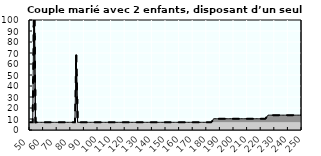
| Category | Coin fiscal marginal (somme des composantes) | Taux d’imposition marginal net |
|---|---|---|
| 50.0 | 7 | 7 |
| 51.0 | 7 | 7 |
| 52.0 | 7 | 7 |
| 53.0 | 138.539 | 138.539 |
| 54.0 | 7 | 7 |
| 55.0 | 7 | 7 |
| 56.0 | 7 | 7 |
| 57.0 | 7 | 7 |
| 58.0 | 7 | 7 |
| 59.0 | 7 | 7 |
| 60.0 | 7 | 7 |
| 61.0 | 7 | 7 |
| 62.0 | 7 | 7 |
| 63.0 | 7 | 7 |
| 64.0 | 7 | 7 |
| 65.0 | 7 | 7 |
| 66.0 | 7 | 7 |
| 67.0 | 7 | 7 |
| 68.0 | 7 | 7 |
| 69.0 | 7 | 7 |
| 70.0 | 7 | 7 |
| 71.0 | 7 | 7 |
| 72.0 | 7 | 7 |
| 73.0 | 7 | 7 |
| 74.0 | 7 | 7 |
| 75.0 | 7 | 7 |
| 76.0 | 7 | 7 |
| 77.0 | 7 | 7 |
| 78.0 | 7 | 7 |
| 79.0 | 7 | 7 |
| 80.0 | 7 | 7 |
| 81.0 | 7 | 7 |
| 82.0 | 7 | 7 |
| 83.0 | 7 | 7 |
| 84.0 | 67.789 | 67.789 |
| 85.0 | 7 | 7 |
| 86.0 | 7 | 7 |
| 87.0 | 7 | 7 |
| 88.0 | 7 | 7 |
| 89.0 | 7 | 7 |
| 90.0 | 7 | 7 |
| 91.0 | 7 | 7 |
| 92.0 | 7 | 7 |
| 93.0 | 7 | 7 |
| 94.0 | 7 | 7 |
| 95.0 | 7 | 7 |
| 96.0 | 7 | 7 |
| 97.0 | 7 | 7 |
| 98.0 | 7 | 7 |
| 99.0 | 7 | 7 |
| 100.0 | 7 | 7 |
| 101.0 | 7 | 7 |
| 102.0 | 7 | 7 |
| 103.0 | 7 | 7 |
| 104.0 | 7 | 7 |
| 105.0 | 7 | 7 |
| 106.0 | 7 | 7 |
| 107.0 | 7 | 7 |
| 108.0 | 7 | 7 |
| 109.0 | 7 | 7 |
| 110.0 | 7 | 7 |
| 111.0 | 7 | 7 |
| 112.0 | 7 | 7 |
| 113.0 | 7 | 7 |
| 114.0 | 7 | 7 |
| 115.0 | 7 | 7 |
| 116.0 | 7 | 7 |
| 117.0 | 7 | 7 |
| 118.0 | 7 | 7 |
| 119.0 | 7 | 7 |
| 120.0 | 7 | 7 |
| 121.0 | 7 | 7 |
| 122.0 | 7 | 7 |
| 123.0 | 7 | 7 |
| 124.0 | 7 | 7 |
| 125.0 | 7 | 7 |
| 126.0 | 7 | 7 |
| 127.0 | 7 | 7 |
| 128.0 | 7 | 7 |
| 129.0 | 7 | 7 |
| 130.0 | 7 | 7 |
| 131.0 | 7 | 7 |
| 132.0 | 7 | 7 |
| 133.0 | 7 | 7 |
| 134.0 | 7 | 7 |
| 135.0 | 7 | 7 |
| 136.0 | 7 | 7 |
| 137.0 | 7 | 7 |
| 138.0 | 7 | 7 |
| 139.0 | 7 | 7 |
| 140.0 | 7 | 7 |
| 141.0 | 7 | 7 |
| 142.0 | 7 | 7 |
| 143.0 | 7 | 7 |
| 144.0 | 7 | 7 |
| 145.0 | 7 | 7 |
| 146.0 | 7 | 7 |
| 147.0 | 7 | 7 |
| 148.0 | 7 | 7 |
| 149.0 | 7 | 7 |
| 150.0 | 7 | 7 |
| 151.0 | 7 | 7 |
| 152.0 | 7 | 7 |
| 153.0 | 7 | 7 |
| 154.0 | 7 | 7 |
| 155.0 | 7 | 7 |
| 156.0 | 7 | 7 |
| 157.0 | 7 | 7 |
| 158.0 | 7 | 7 |
| 159.0 | 7 | 7 |
| 160.0 | 7 | 7 |
| 161.0 | 7 | 7 |
| 162.0 | 7 | 7 |
| 163.0 | 7 | 7 |
| 164.0 | 7 | 7 |
| 165.0 | 7 | 7 |
| 166.0 | 7 | 7 |
| 167.0 | 7 | 7 |
| 168.0 | 7 | 7 |
| 169.0 | 7 | 7 |
| 170.0 | 7 | 7 |
| 171.0 | 7 | 7 |
| 172.0 | 7 | 7 |
| 173.0 | 7 | 7 |
| 174.0 | 7 | 7 |
| 175.0 | 7 | 7 |
| 176.0 | 7 | 7 |
| 177.0 | 7 | 7 |
| 178.0 | 7 | 7 |
| 179.0 | 7 | 7 |
| 180.0 | 7 | 7 |
| 181.0 | 7 | 7 |
| 182.0 | 7 | 7 |
| 183.0 | 7 | 7 |
| 184.0 | 8.118 | 8.118 |
| 185.0 | 10.25 | 10.25 |
| 186.0 | 10.25 | 10.25 |
| 187.0 | 10.25 | 10.25 |
| 188.0 | 10.25 | 10.25 |
| 189.0 | 10.25 | 10.25 |
| 190.0 | 10.25 | 10.25 |
| 191.0 | 10.25 | 10.25 |
| 192.0 | 10.25 | 10.25 |
| 193.0 | 10.25 | 10.25 |
| 194.0 | 10.25 | 10.25 |
| 195.0 | 10.25 | 10.25 |
| 196.0 | 10.25 | 10.25 |
| 197.0 | 10.25 | 10.25 |
| 198.0 | 10.25 | 10.25 |
| 199.0 | 10.25 | 10.25 |
| 200.0 | 10.25 | 10.25 |
| 201.0 | 10.25 | 10.25 |
| 202.0 | 10.25 | 10.25 |
| 203.0 | 10.25 | 10.25 |
| 204.0 | 10.25 | 10.25 |
| 205.0 | 10.25 | 10.25 |
| 206.0 | 10.25 | 10.25 |
| 207.0 | 10.25 | 10.25 |
| 208.0 | 10.25 | 10.25 |
| 209.0 | 10.25 | 10.25 |
| 210.0 | 10.25 | 10.25 |
| 211.0 | 10.25 | 10.25 |
| 212.0 | 10.25 | 10.25 |
| 213.0 | 10.25 | 10.25 |
| 214.0 | 10.25 | 10.25 |
| 215.0 | 10.25 | 10.25 |
| 216.0 | 10.25 | 10.25 |
| 217.0 | 10.25 | 10.25 |
| 218.0 | 10.25 | 10.25 |
| 219.0 | 10.25 | 10.25 |
| 220.0 | 10.25 | 10.25 |
| 221.0 | 10.25 | 10.25 |
| 222.0 | 10.25 | 10.25 |
| 223.0 | 10.25 | 10.25 |
| 224.0 | 11.683 | 11.683 |
| 225.0 | 13.5 | 13.5 |
| 226.0 | 13.5 | 13.5 |
| 227.0 | 13.5 | 13.5 |
| 228.0 | 13.5 | 13.5 |
| 229.0 | 13.5 | 13.5 |
| 230.0 | 13.5 | 13.5 |
| 231.0 | 13.5 | 13.5 |
| 232.0 | 13.5 | 13.5 |
| 233.0 | 13.5 | 13.5 |
| 234.0 | 13.5 | 13.5 |
| 235.0 | 13.5 | 13.5 |
| 236.0 | 13.5 | 13.5 |
| 237.0 | 13.5 | 13.5 |
| 238.0 | 13.5 | 13.5 |
| 239.0 | 13.5 | 13.5 |
| 240.0 | 13.5 | 13.5 |
| 241.0 | 13.5 | 13.5 |
| 242.0 | 13.5 | 13.5 |
| 243.0 | 13.5 | 13.5 |
| 244.0 | 13.5 | 13.5 |
| 245.0 | 13.5 | 13.5 |
| 246.0 | 13.5 | 13.5 |
| 247.0 | 13.5 | 13.5 |
| 248.0 | 13.5 | 13.5 |
| 249.0 | 13.5 | 13.5 |
| 250.0 | 13.5 | 13.5 |